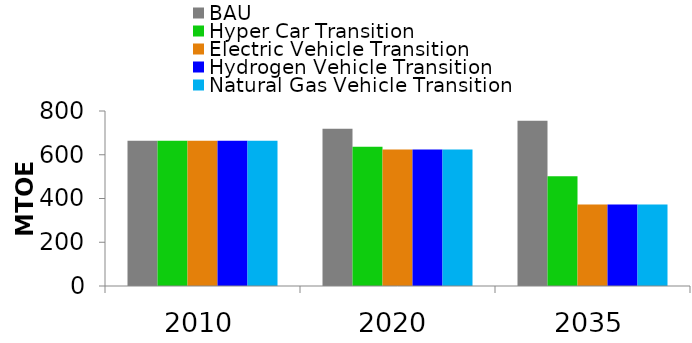
| Category | BAU | Hyper Car Transition | Electric Vehicle Transition | Hydrogen Vehicle Transition | Natural Gas Vehicle Transition |
|---|---|---|---|---|---|
| 2010.0 | 664.444 | 664.444 | 664.444 | 664.444 | 664.444 |
| 2020.0 | 719.308 | 636.829 | 624.144 | 624.144 | 624.144 |
| 2035.0 | 755.755 | 501.512 | 372.187 | 372.187 | 372.187 |